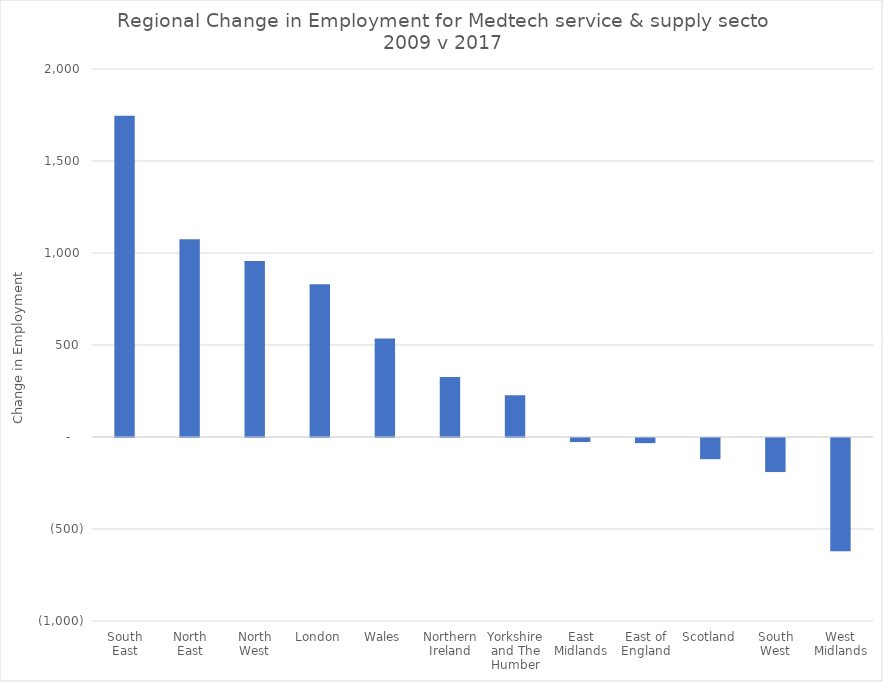
| Category | Change in Employment for Medtech service & supply  2009 to 2017 |
|---|---|
| South East | 1746 |
| North East | 1075 |
| North West | 956 |
| London | 830 |
| Wales | 535 |
| Northern Ireland | 326 |
| Yorkshire and The Humber | 227 |
| East Midlands | -22 |
| East of England | -28 |
| Scotland | -115 |
| South West | -185 |
| West Midlands | -616 |